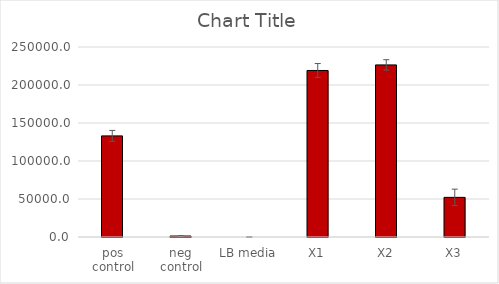
| Category | Series 0 |
|---|---|
| pos control | 133047.162 |
| neg control | 1292.221 |
| LB media | 0 |
| X1 | 219114.911 |
| X2 | 226421.9 |
| X3 | 52144.528 |